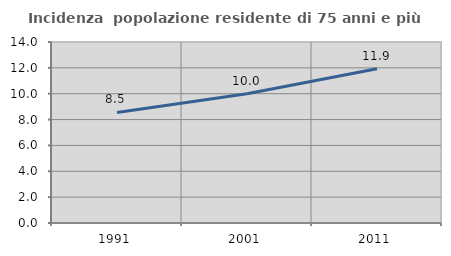
| Category | Incidenza  popolazione residente di 75 anni e più |
|---|---|
| 1991.0 | 8.549 |
| 2001.0 | 9.994 |
| 2011.0 | 11.926 |